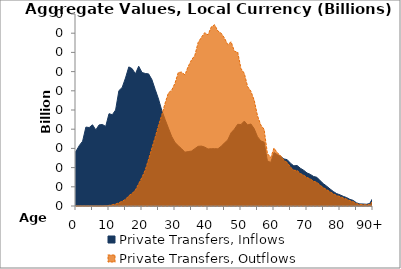
| Category | Private Transfers, Inflows | Private Transfers, Outflows |
|---|---|---|
| 0 | 57.008 | 0 |
|  | 62.996 | 0 |
| 2 | 67.493 | 0 |
| 3 | 82.213 | 0 |
| 4 | 81.724 | 0 |
| 5 | 84.604 | 0 |
| 6 | 79.285 | 0 |
| 7 | 84.46 | 0.003 |
| 8 | 84.937 | 0.025 |
| 9 | 82.886 | 0.152 |
| 10 | 96.145 | 0.621 |
| 11 | 95.106 | 1.367 |
| 12 | 99.968 | 2.027 |
| 13 | 120.141 | 3.401 |
| 14 | 123.509 | 4.959 |
| 15 | 133.335 | 6.927 |
| 16 | 144.903 | 10.669 |
| 17 | 143.067 | 13.121 |
| 18 | 137.648 | 16.583 |
| 19 | 145.592 | 23.245 |
| 20 | 139.021 | 29.876 |
| 21 | 138.05 | 37.614 |
| 22 | 137.613 | 48.699 |
| 23 | 131.696 | 60.364 |
| 24 | 121.467 | 71.696 |
| 25 | 111.442 | 83.986 |
| 26 | 99.438 | 94.831 |
| 27 | 90.155 | 107.106 |
| 28 | 81.172 | 117.762 |
| 29 | 72.446 | 120.646 |
| 30 | 66.17 | 127.932 |
| 31 | 62.748 | 139.134 |
| 32 | 59.66 | 139.429 |
| 33 | 56.07 | 136.587 |
| 34 | 56.668 | 145.336 |
| 35 | 57.242 | 152.138 |
| 36 | 59.711 | 156.796 |
| 37 | 62.148 | 170.218 |
| 38 | 62.43 | 175.727 |
| 39 | 61.382 | 180.522 |
| 40 | 59.391 | 178.325 |
| 41 | 59.692 | 186.578 |
| 42 | 59.731 | 188.831 |
| 43 | 59.582 | 182.25 |
| 44 | 62.265 | 179.998 |
| 45 | 65.694 | 174.851 |
| 46 | 68.894 | 168.083 |
| 47 | 76.313 | 171.08 |
| 48 | 80.022 | 161.159 |
| 49 | 85.102 | 160.229 |
| 50 | 84.875 | 143.164 |
| 51 | 88.444 | 138.192 |
| 52 | 84.428 | 124.44 |
| 53 | 85.425 | 119.52 |
| 54 | 80.545 | 110.193 |
| 55 | 72.159 | 94.074 |
| 56 | 67.836 | 84.353 |
| 57 | 66.466 | 79.899 |
| 58 | 47.004 | 54.769 |
| 59 | 45.409 | 50.311 |
| 60 | 55.629 | 60.328 |
| 61 | 53.534 | 55.442 |
| 62 | 51.632 | 52.441 |
| 63 | 49.027 | 47.6 |
| 64 | 48.261 | 45.323 |
| 65 | 44.52 | 40.539 |
| 66 | 41.856 | 37.246 |
| 67 | 42.183 | 37.018 |
| 68 | 39.296 | 33.801 |
| 69 | 37.217 | 32.099 |
| 70 | 34.408 | 29.682 |
| 71 | 32.943 | 28.281 |
| 72 | 30.746 | 25.741 |
| 73 | 29.872 | 24.681 |
| 74 | 26.349 | 21.604 |
| 75 | 23.171 | 19.033 |
| 76 | 20.566 | 16.952 |
| 77 | 17.715 | 14.744 |
| 78 | 15.055 | 12.747 |
| 79 | 12.902 | 10.95 |
| 80 | 11.615 | 9.803 |
| 81 | 10.037 | 8.382 |
| 82 | 8.774 | 7.167 |
| 83 | 6.91 | 5.461 |
| 84 | 5.855 | 4.5 |
| 85 | 3.283 | 2.448 |
| 86 | 2.183 | 1.574 |
| 87 | 2.077 | 1.443 |
| 88 | 1.806 | 1.168 |
| 89 | 2.571 | 1.588 |
| 90+ | 8.567 | 5.062 |